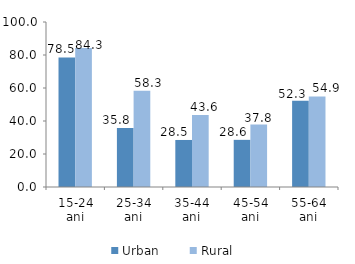
| Category | Urban | Rural |
|---|---|---|
| 15-24 ani | 78.512 | 84.313 |
| 25-34 ani | 35.801 | 58.26 |
| 35-44 ani | 28.505 | 43.646 |
| 45-54 ani | 28.579 | 37.816 |
| 55-64 ani | 52.324 | 54.899 |